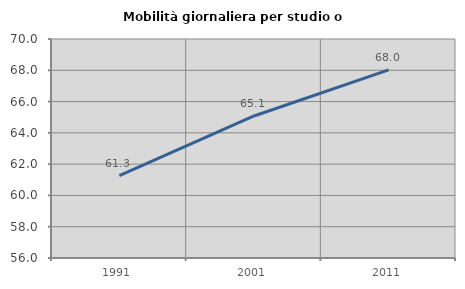
| Category | Mobilità giornaliera per studio o lavoro |
|---|---|
| 1991.0 | 61.273 |
| 2001.0 | 65.079 |
| 2011.0 | 68.025 |